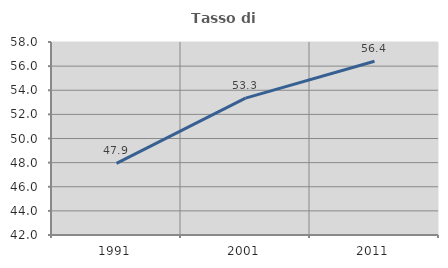
| Category | Tasso di occupazione   |
|---|---|
| 1991.0 | 47.943 |
| 2001.0 | 53.35 |
| 2011.0 | 56.409 |